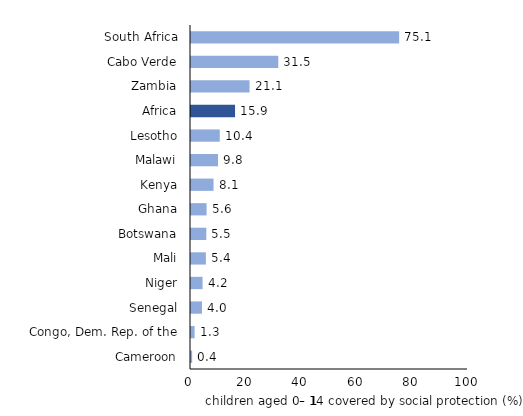
| Category | Children covered by SP, % of children 0-14 |
|---|---|
| Cameroon | 0.415 |
| Congo, Dem. Rep. of the | 1.3 |
| Senegal | 3.959 |
| Niger | 4.169 |
| Mali | 5.368 |
| Botswana | 5.529 |
| Ghana | 5.629 |
| Kenya | 8.135 |
| Malawi | 9.757 |
| Lesotho | 10.388 |
| Africa | 15.9 |
| Zambia | 21.132 |
| Cabo Verde | 31.511 |
| South Africa | 75.147 |